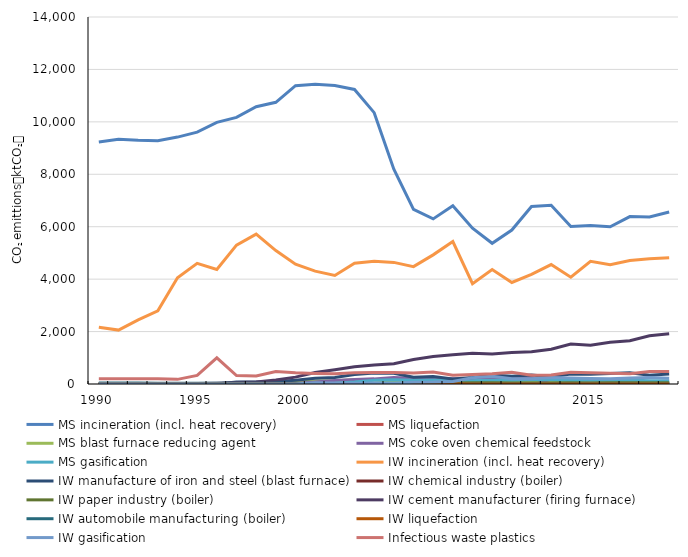
| Category | MS incineration (incl. heat recovery) | MS liquefaction | MS blast furnace reducing agent | MS coke oven chemical feedstock | MS gasification | IW incineration (incl. heat recovery) | IW manufacture of iron and steel (blast furnace) | IW chemical industry (boiler) | IW paper industry (boiler) | IW cement manufacturer (firing furnace) | IW automobile manufacturing (boiler) | IW liquefaction | IW gasification | Infectious waste plastics |
|---|---|---|---|---|---|---|---|---|---|---|---|---|---|---|
| 1990.0 | 9232.162 | 0 | 0 | 0 | 0 | 2161.919 | 0 | 13.696 | 0 | 0 | 40.896 | 0 | 0 | 199.414 |
| 1991.0 | 9333.778 | 0 | 0 | 0 | 0 | 2056.429 | 0 | 11.491 | 0 | 0 | 42.116 | 0 | 0 | 199.414 |
| 1992.0 | 9296.826 | 0 | 0 | 0 | 0 | 2448.872 | 0 | 6.945 | 0 | 0 | 36.916 | 0 | 0 | 199.414 |
| 1993.0 | 9280.437 | 0 | 0 | 0 | 0 | 2790.496 | 0 | 14.271 | 0 | 0 | 29.484 | 0 | 0 | 199.414 |
| 1994.0 | 9419.005 | 0 | 0 | 0 | 0 | 4055.239 | 0 | 11.581 | 0 | 0 | 25.797 | 0 | 0 | 176.937 |
| 1995.0 | 9607.337 | 0 | 0 | 0 | 0 | 4604.167 | 0 | 9.971 | 0 | 23.1 | 26.1 | 0 | 0 | 328.196 |
| 1996.0 | 9982.512 | 0 | 0 | 0 | 0 | 4369.814 | 0 | 9.664 | 0 | 33.367 | 26.346 | 0 | 0 | 997.343 |
| 1997.0 | 10172.632 | 0 | 0 | 0 | 0 | 5298.031 | 77 | 16.311 | 0 | 56.467 | 26.666 | 0 | 0 | 319.555 |
| 1998.0 | 10577.308 | 0 | 0 | 0 | 0 | 5717.106 | 77 | 14.301 | 0 | 74.433 | 27.03 | 0 | 0 | 309.428 |
| 1999.0 | 10746.941 | 0 | 0 | 0 | 0 | 5090.14 | 94.967 | 12.24 | 3.272 | 154 | 24.419 | 0 | 0 | 476.96 |
| 2000.0 | 11381.151 | 9.086 | 67.918 | 15.353 | 1.725 | 4568.159 | 146.23 | 12.24 | 7.271 | 261.8 | 20.281 | 1.902 | 0 | 428.049 |
| 2001.0 | 11431.517 | 21.576 | 115.789 | 73.079 | 20.354 | 4306.32 | 218.843 | 9.201 | 4.397 | 438.9 | 16.679 | 4.143 | 47.902 | 403.514 |
| 2002.0 | 11389.547 | 18.467 | 127.13 | 129.755 | 30.246 | 4139.699 | 245.919 | 13.635 | 4.615 | 541.567 | 15.787 | 6.045 | 35.9 | 387.901 |
| 2003.0 | 11236.125 | 15.807 | 161.005 | 172.585 | 75.902 | 4609.053 | 358.978 | 15.462 | 3.647 | 654.5 | 13.8 | 3.121 | 33.117 | 431.88 |
| 2004.0 | 10351.877 | 17.372 | 151.965 | 195.601 | 141.129 | 4679.456 | 423.134 | 10.778 | 3.624 | 726.367 | 12.703 | 2.161 | 35.164 | 438.477 |
| 2005.0 | 8195.45 | 18.886 | 99.396 | 246.454 | 158.371 | 4639.56 | 410.578 | 5.59 | 7.081 | 775.133 | 10.262 | 1.886 | 27.858 | 434.739 |
| 2006.0 | 6664.177 | 11.852 | 105.099 | 219.372 | 147.331 | 4477.633 | 262.025 | 5.136 | 22.181 | 936.833 | 9.92 | 5.765 | 66.089 | 419.566 |
| 2007.0 | 6298.268 | 11.496 | 88.671 | 200.451 | 152.631 | 4926.168 | 289 | 2.9 | 36.208 | 1047.2 | 0 | 3.629 | 74.151 | 461.595 |
| 2008.0 | 6802.764 | 7.371 | 46.841 | 199.091 | 126.045 | 5436.199 | 190.099 | 4.222 | 41.788 | 1116.5 | 0 | 7.682 | 99.151 | 336.233 |
| 2009.0 | 5946.396 | 18.165 | 74.503 | 210.641 | 120.354 | 3825.616 | 247.868 | 3.529 | 44.873 | 1172.966 | 0 | 2.723 | 235.473 | 365.75 |
| 2010.0 | 5367.407 | 2.853 | 72.081 | 248.579 | 143.019 | 4366.498 | 344.841 | 3.374 | 45.662 | 1140.982 | 0 | 1.572 | 299.091 | 395.267 |
| 2011.0 | 5872.206 | 0 | 69.703 | 237.857 | 138.567 | 3872.877 | 292.985 | 2.942 | 41.202 | 1202.104 | 0 | 2.417 | 199.847 | 451.733 |
| 2012.0 | 6773.721 | 0 | 70.273 | 240.671 | 166.072 | 4181.915 | 344.033 | 2.893 | 39.585 | 1227.413 | 0 | 2.637 | 203.229 | 336.233 |
| 2013.0 | 6819.134 | 0 | 82.074 | 0 | 157.413 | 4555.463 | 275.35 | 1.683 | 36.429 | 1327.182 | 0 | 2.452 | 249.569 | 341.367 |
| 2014.0 | 6010.26 | 0 | 72.425 | 24.344 | 136.361 | 4075.856 | 381.673 | 0.932 | 44.891 | 1524.283 | 0 | 2.723 | 229.57 | 451.733 |
| 2015.0 | 6048.435 | 0 | 82.252 | 40.648 | 147.874 | 4677.258 | 369.798 | 1.148 | 40.815 | 1475.411 | 0 | 2.797 | 208.03 | 426.067 |
| 2016.0 | 5999.672 | 0 | 78.958 | 34.624 | 146.511 | 4553.026 | 400.512 | 0.56 | 43.701 | 1596.25 | 0 | 0.287 | 202.547 | 410.667 |
| 2017.0 | 6385.103 | 0 | 75.878 | 44.997 | 153.427 | 4713.9 | 431.468 | 7.73 | 46.993 | 1647.303 | 0 | 0 | 232.39 | 395.267 |
| 2018.0 | 6370.25 | 0 | 76.61 | 23.96 | 124.355 | 4777.442 | 336.891 | 8.899 | 47.369 | 1840.238 | 0 | 2.002 | 249.734 | 479.967 |
| 2019.0 | 6561.602 | 0 | 74.293 | 33.716 | 119.797 | 4816.964 | 382.195 | 9.89 | 46.373 | 1912.43 | 0 | 2.002 | 220.309 | 474.833 |